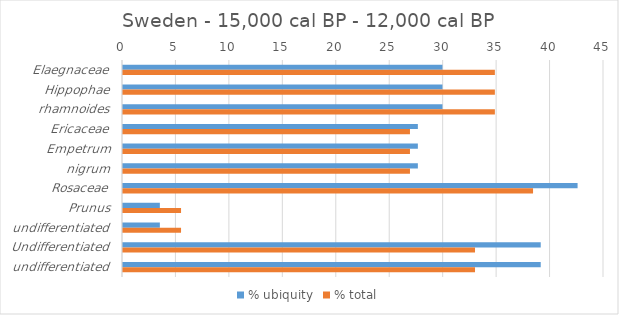
| Category | % ubiquity | % total |
|---|---|---|
| Elaegnaceae | 29.885 | 34.791 |
| Hippophae | 29.885 | 34.791 |
| rhamnoides | 29.885 | 34.791 |
| Ericaceae | 27.586 | 26.847 |
| Empetrum | 27.586 | 26.847 |
| nigrum | 27.586 | 26.847 |
| Rosaceae | 42.529 | 38.362 |
| Prunus | 3.448 | 5.43 |
| undifferentiated | 3.448 | 5.43 |
| Undifferentiated | 39.08 | 32.933 |
| undifferentiated | 39.08 | 32.933 |